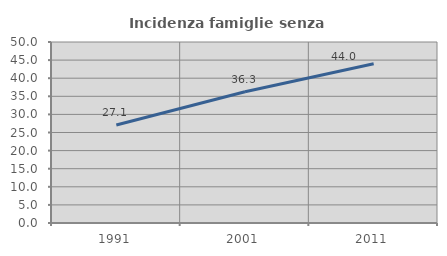
| Category | Incidenza famiglie senza nuclei |
|---|---|
| 1991.0 | 27.061 |
| 2001.0 | 36.27 |
| 2011.0 | 43.982 |